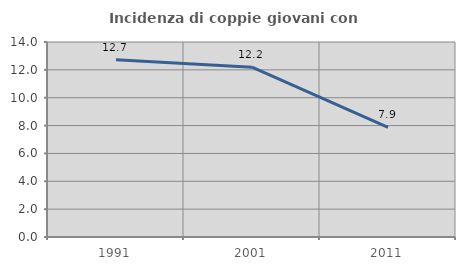
| Category | Incidenza di coppie giovani con figli |
|---|---|
| 1991.0 | 12.727 |
| 2001.0 | 12.195 |
| 2011.0 | 7.874 |